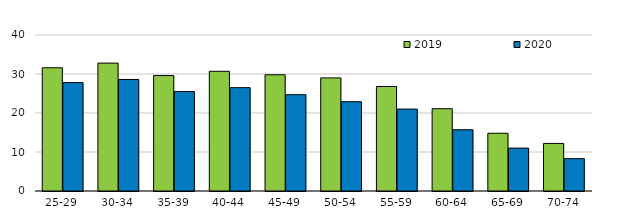
| Category | 2019 | 2020 |
|---|---|---|
| 25-29 | 31.6 | 27.8 |
| 30-34 | 32.8 | 28.6 |
| 35-39 | 29.6 | 25.5 |
| 40-44 | 30.7 | 26.5 |
| 45-49 | 29.8 | 24.7 |
| 50-54 | 29 | 22.9 |
| 55-59 | 26.8 | 21 |
| 60-64 | 21.1 | 15.7 |
| 65-69 | 14.8 | 11 |
| 70-74 | 12.2 | 8.3 |